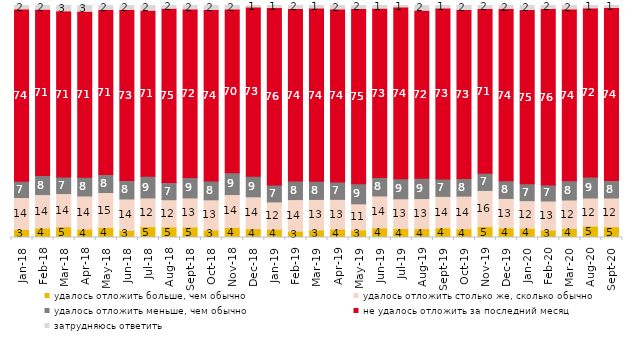
| Category | удалось отложить больше, чем обычно | удалось отложить столько же, сколько обычно | удалось отложить меньше, чем обычно | не удалось отложить за последний месяц | затрудняюсь ответить |
|---|---|---|---|---|---|
| 2018-01-01 | 3.45 | 13.8 | 7 | 73.9 | 1.85 |
| 2018-02-01 | 4.05 | 14.45 | 8.25 | 71.3 | 1.95 |
| 2018-03-01 | 4.6 | 14.35 | 7.1 | 71.3 | 2.65 |
| 2018-04-01 | 3.6 | 14.3 | 8.05 | 71.25 | 2.8 |
| 2018-05-01 | 4.3 | 15.1 | 7.75 | 70.75 | 2.1 |
| 2018-06-01 | 3.05 | 13.55 | 7.95 | 73.4 | 2.05 |
| 2018-07-01 | 4.65 | 12.4 | 9.35 | 71.2 | 2.4 |
| 2018-08-01 | 4.55 | 11.75 | 7.45 | 74.7 | 1.55 |
| 2018-09-01 | 4.5 | 12.55 | 8.8 | 72.3 | 1.85 |
| 2018-10-01 | 3.2 | 13.05 | 8.05 | 73.6 | 2.1 |
| 2018-11-01 | 4.341 | 14.172 | 9.381 | 70.259 | 1.846 |
| 2018-12-01 | 3.8 | 13.75 | 8.9 | 72.55 | 1 |
| 2019-01-01 | 3.55 | 11.8 | 7.25 | 76.1 | 1.3 |
| 2019-02-01 | 2.7 | 13.65 | 7.95 | 74.05 | 1.65 |
| 2019-03-01 | 3.182 | 13.227 | 7.857 | 74.291 | 1.442 |
| 2019-04-01 | 3.614 | 12.822 | 7.475 | 74.257 | 1.832 |
| 2019-05-01 | 3.219 | 11.293 | 8.618 | 75.285 | 1.585 |
| 2019-06-01 | 4.14 | 13.766 | 7.93 | 72.668 | 1.496 |
| 2019-07-01 | 3.812 | 12.871 | 8.663 | 73.663 | 0.99 |
| 2019-08-01 | 3.796 | 12.987 | 8.791 | 72.028 | 2.398 |
| 2019-09-01 | 4.158 | 13.564 | 7.475 | 73.366 | 1.436 |
| 2019-10-01 | 3.762 | 14.059 | 7.574 | 72.525 | 2.079 |
| 2019-11-01 | 4.703 | 15.594 | 7.376 | 70.743 | 1.584 |
| 2019-12-01 | 4.109 | 12.723 | 7.624 | 73.812 | 1.733 |
| 2020-01-01 | 3.96 | 11.931 | 7.228 | 74.703 | 2.178 |
| 2020-02-01 | 3.168 | 12.574 | 6.931 | 75.693 | 1.634 |
| 2020-03-01 | 3.917 | 12.246 | 8.28 | 73.723 | 1.834 |
| 2020-08-01 | 4.916 | 12.115 | 9.086 | 72.493 | 1.39 |
| 2020-09-01 | 4.629 | 12.394 | 7.566 | 74.216 | 1.195 |